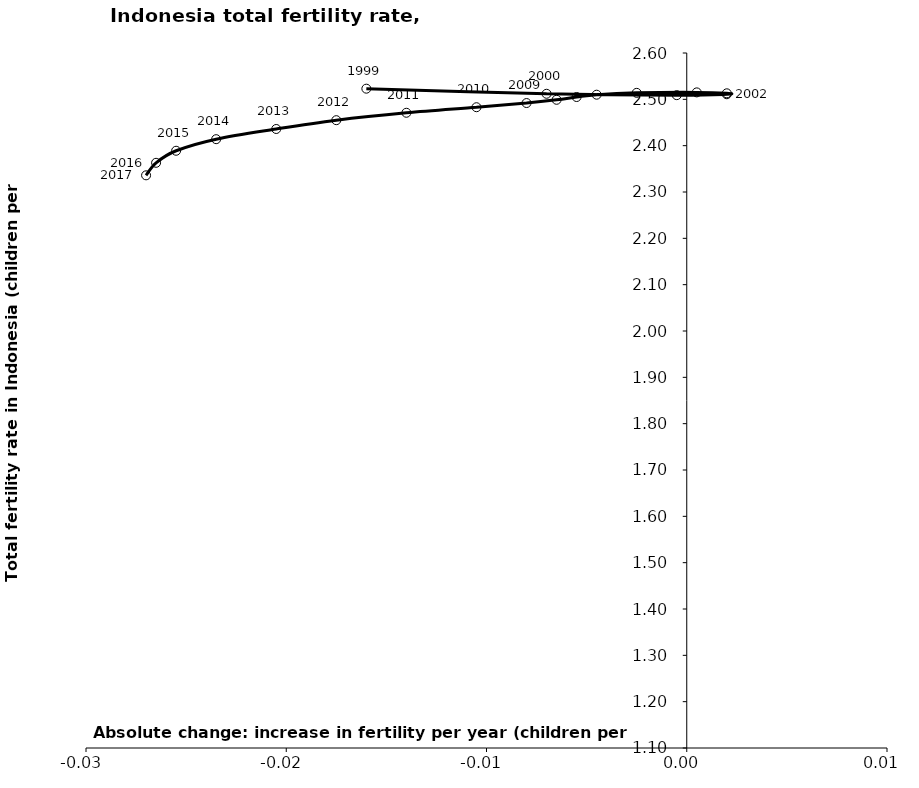
| Category | Series 0 |
|---|---|
| -0.016000000000000014 | 2.523 |
| -0.007000000000000117 | 2.512 |
| -0.0004999999999999449 | 2.509 |
| 0.0020000000000000018 | 2.511 |
| 0.0020000000000000018 | 2.513 |
| 0.0004999999999999449 | 2.515 |
| -0.0025000000000001688 | 2.514 |
| -0.0044999999999999485 | 2.51 |
| -0.005499999999999838 | 2.505 |
| -0.00649999999999995 | 2.499 |
| -0.008000000000000007 | 2.492 |
| -0.010499999999999954 | 2.483 |
| -0.014000000000000012 | 2.471 |
| -0.01750000000000007 | 2.455 |
| -0.020499999999999963 | 2.436 |
| -0.023500000000000076 | 2.414 |
| -0.025500000000000078 | 2.389 |
| -0.026499999999999968 | 2.363 |
| -0.027000000000000135 | 2.336 |